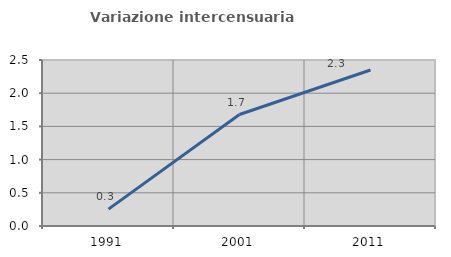
| Category | Variazione intercensuaria annua |
|---|---|
| 1991.0 | 0.254 |
| 2001.0 | 1.679 |
| 2011.0 | 2.349 |